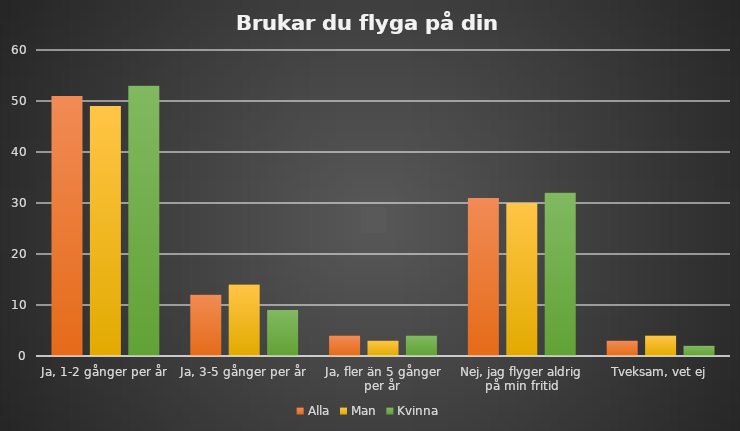
| Category | Alla | Man | Kvinna |
|---|---|---|---|
| Ja, 1-2 gånger per år | 51 | 49 | 53 |
| Ja, 3-5 gånger per år | 12 | 14 | 9 |
| Ja, fler än 5 gånger per år | 4 | 3 | 4 |
| Nej, jag flyger aldrig på min fritid | 31 | 30 | 32 |
| Tveksam, vet ej | 3 | 4 | 2 |